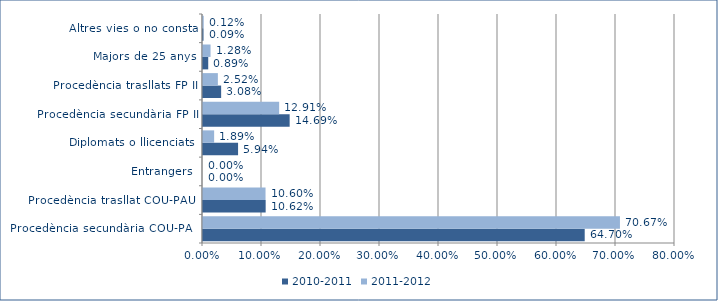
| Category | 2010-2011 | 2011-2012 |
|---|---|---|
| Procedència secundària COU-PAU | 0.647 | 0.707 |
| Procedència trasllat COU-PAU  | 0.106 | 0.106 |
| Entrangers | 0 | 0 |
| Diplomats o llicenciats | 0.059 | 0.019 |
| Procedència secundària FP II | 0.147 | 0.129 |
| Procedència trasllats FP II | 0.031 | 0.025 |
| Majors de 25 anys | 0.009 | 0.013 |
| Altres vies o no consta | 0.001 | 0.001 |